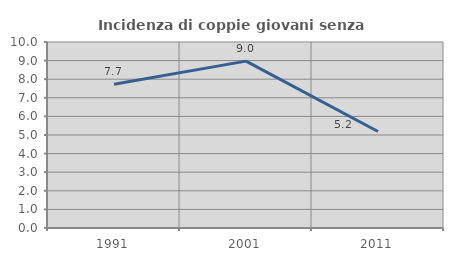
| Category | Incidenza di coppie giovani senza figli |
|---|---|
| 1991.0 | 7.725 |
| 2001.0 | 8.972 |
| 2011.0 | 5.189 |